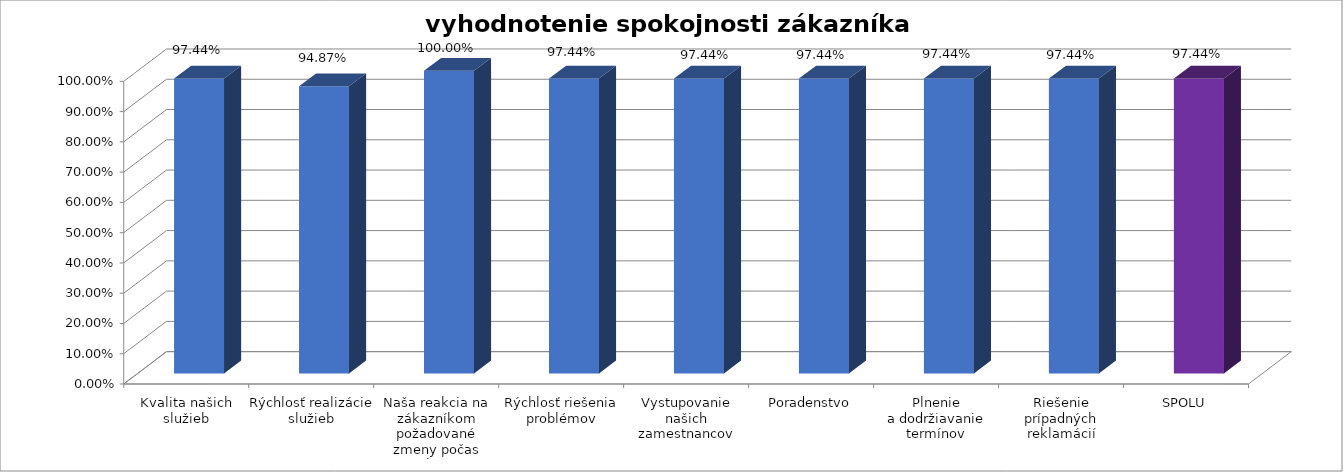
| Category | vyhodnotenie spokojnosti zákazníka |
|---|---|
| Kvalita našich služieb | 0.974 |
| Rýchlosť realizácie služieb | 0.949 |
| Naša reakcia na zákazníkom požadované zmeny počas realizácie | 1 |
| Rýchlosť riešenia problémov | 0.974 |
| Vystupovanie našich zamestnancov | 0.974 |
| Poradenstvo | 0.974 |
| Plnenie a dodržiavanie termínov | 0.974 |
| Riešenie prípadných reklamácií | 0.974 |
| SPOLU | 0.974 |